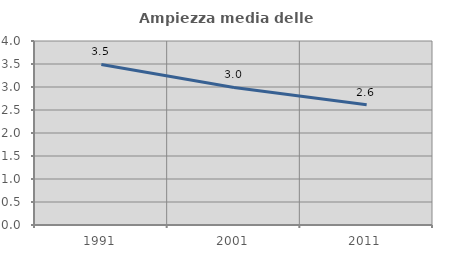
| Category | Ampiezza media delle famiglie |
|---|---|
| 1991.0 | 3.491 |
| 2001.0 | 2.991 |
| 2011.0 | 2.613 |